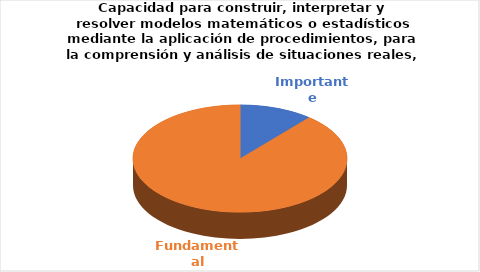
| Category | Series 0 |
|---|---|
| Importante | 2 |
| Fundamental | 16 |